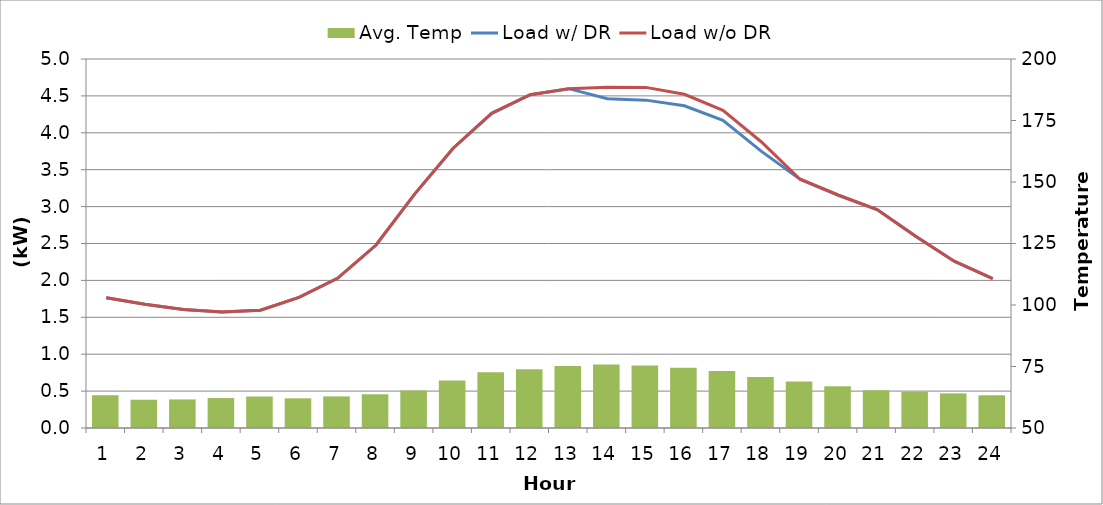
| Category | Avg. Temp |
|---|---|
| 0 | 63.33 |
| 1 | 61.489 |
| 2 | 61.616 |
| 3 | 62.176 |
| 4 | 62.796 |
| 5 | 62.065 |
| 6 | 62.847 |
| 7 | 63.713 |
| 8 | 65.276 |
| 9 | 69.359 |
| 10 | 72.652 |
| 11 | 73.916 |
| 12 | 75.213 |
| 13 | 75.814 |
| 14 | 75.439 |
| 15 | 74.453 |
| 16 | 73.15 |
| 17 | 70.75 |
| 18 | 68.884 |
| 19 | 67.006 |
| 20 | 65.362 |
| 21 | 64.743 |
| 22 | 64.078 |
| 23 | 63.309 |